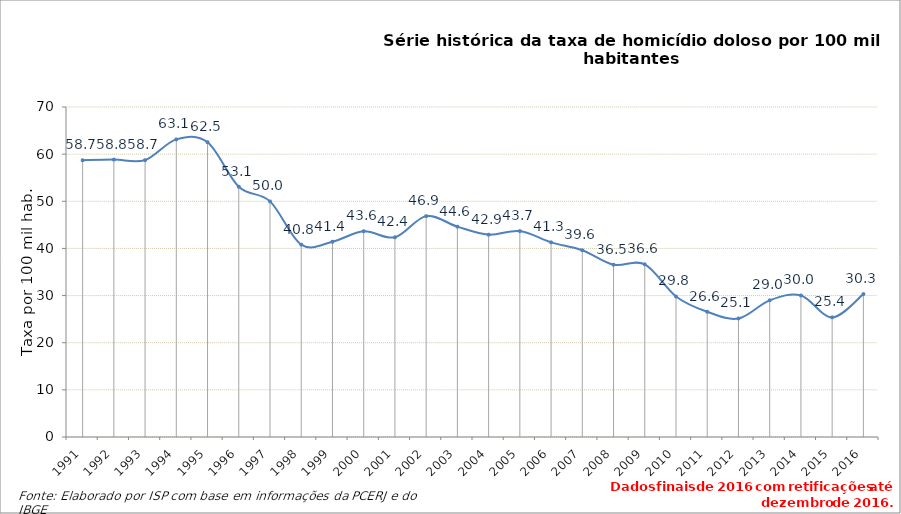
| Category | Series 0 |
|---|---|
| 1991.0 | 58.699 |
| 1992.0 | 58.84 |
| 1993.0 | 58.724 |
| 1994.0 | 63.128 |
| 1995.0 | 62.532 |
| 1996.0 | 53.097 |
| 1997.0 | 49.983 |
| 1998.0 | 40.805 |
| 1999.0 | 41.416 |
| 2000.0 | 43.649 |
| 2001.0 | 42.363 |
| 2002.0 | 46.852 |
| 2003.0 | 44.62 |
| 2004.0 | 42.924 |
| 2005.0 | 43.682 |
| 2006.0 | 41.288 |
| 2007.0 | 39.625 |
| 2008.0 | 36.543 |
| 2009.0 | 36.629 |
| 2010.0 | 29.813 |
| 2011.0 | 26.557 |
| 2012.0 | 25.143 |
| 2013.0 | 28.987 |
| 2014.0 | 30.022 |
| 2015.0 | 25.378 |
| 2016.0 | 30.308 |